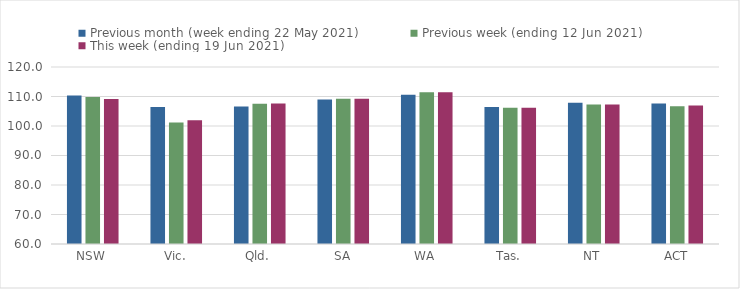
| Category | Previous month (week ending 22 May 2021) | Previous week (ending 12 Jun 2021) | This week (ending 19 Jun 2021) |
|---|---|---|---|
| NSW | 110.33 | 109.86 | 109.12 |
| Vic. | 106.48 | 101.2 | 101.97 |
| Qld. | 106.65 | 107.51 | 107.62 |
| SA | 108.98 | 109.24 | 109.24 |
| WA | 110.63 | 111.47 | 111.47 |
| Tas. | 106.4 | 106.18 | 106.18 |
| NT | 107.85 | 107.33 | 107.33 |
| ACT | 107.65 | 106.71 | 106.95 |